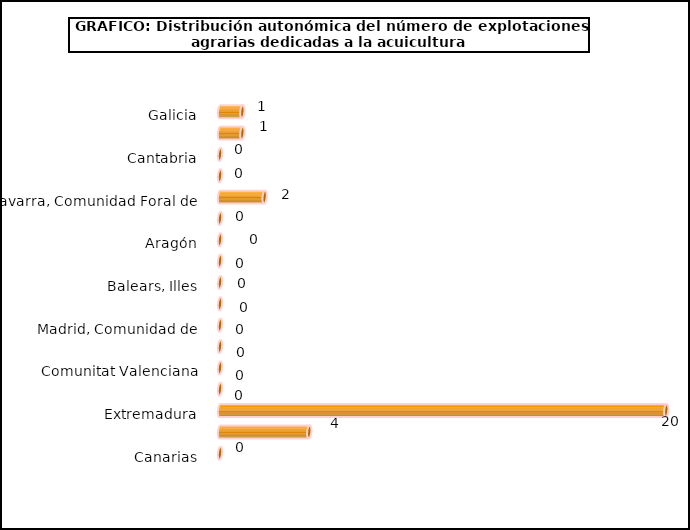
| Category | num. Explotaciones |
|---|---|
| Galicia | 1 |
| Asturias, Principado de | 1 |
| Cantabria | 0 |
| País Vasco | 0 |
| Navarra, Comunidad Foral de | 2 |
| Rioja, La | 0 |
| Aragón | 0 |
| Cataluña | 0 |
| Balears, Illes | 0 |
| Castilla y León | 0 |
| Madrid, Comunidad de | 0 |
| Castilla - La Mancha | 0 |
| Comunitat Valenciana | 0 |
| Murcia, Región de | 0 |
| Extremadura | 20 |
| Andalucía | 4 |
| Canarias | 0 |